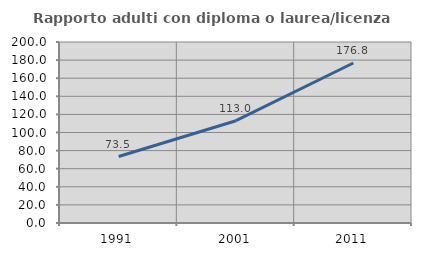
| Category | Rapporto adulti con diploma o laurea/licenza media  |
|---|---|
| 1991.0 | 73.452 |
| 2001.0 | 113.038 |
| 2011.0 | 176.768 |